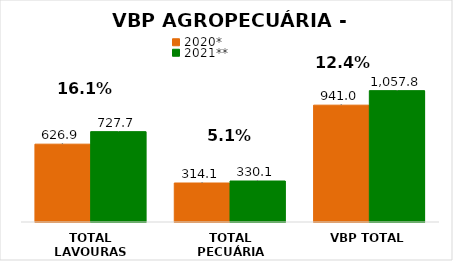
| Category | 2020* | 2021** |
|---|---|---|
| TOTAL LAVOURAS | 626.926 | 727.717 |
| TOTAL PECUÁRIA | 314.054 | 330.124 |
| VBP TOTAL | 940.98 | 1057.841 |